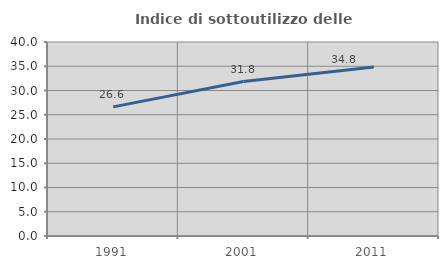
| Category | Indice di sottoutilizzo delle abitazioni  |
|---|---|
| 1991.0 | 26.62 |
| 2001.0 | 31.848 |
| 2011.0 | 34.846 |